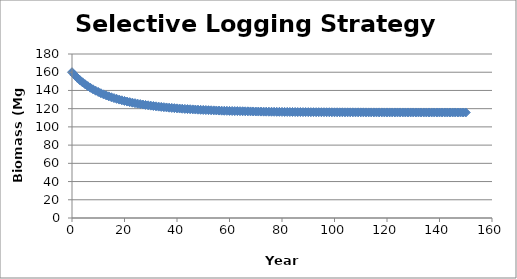
| Category | Series 0 |
|---|---|
| 0.0 | 160 |
| 1.0 | 156.8 |
| 2.0 | 153.914 |
| 3.0 | 151.299 |
| 4.0 | 148.922 |
| 5.0 | 146.753 |
| 6.0 | 144.768 |
| 7.0 | 142.946 |
| 8.0 | 141.27 |
| 9.0 | 139.724 |
| 10.0 | 138.294 |
| 11.0 | 136.97 |
| 12.0 | 135.742 |
| 13.0 | 134.6 |
| 14.0 | 133.537 |
| 15.0 | 132.545 |
| 16.0 | 131.62 |
| 17.0 | 130.754 |
| 18.0 | 129.944 |
| 19.0 | 129.185 |
| 20.0 | 128.473 |
| 21.0 | 127.805 |
| 22.0 | 127.176 |
| 23.0 | 126.585 |
| 24.0 | 126.029 |
| 25.0 | 125.505 |
| 26.0 | 125.011 |
| 27.0 | 124.544 |
| 28.0 | 124.104 |
| 29.0 | 123.689 |
| 30.0 | 123.296 |
| 31.0 | 122.924 |
| 32.0 | 122.573 |
| 33.0 | 122.24 |
| 34.0 | 121.925 |
| 35.0 | 121.626 |
| 36.0 | 121.343 |
| 37.0 | 121.075 |
| 38.0 | 120.82 |
| 39.0 | 120.579 |
| 40.0 | 120.35 |
| 41.0 | 120.132 |
| 42.0 | 119.926 |
| 43.0 | 119.729 |
| 44.0 | 119.543 |
| 45.0 | 119.366 |
| 46.0 | 119.197 |
| 47.0 | 119.037 |
| 48.0 | 118.884 |
| 49.0 | 118.739 |
| 50.0 | 118.601 |
| 51.0 | 118.47 |
| 52.0 | 118.345 |
| 53.0 | 118.226 |
| 54.0 | 118.113 |
| 55.0 | 118.005 |
| 56.0 | 117.902 |
| 57.0 | 117.804 |
| 58.0 | 117.711 |
| 59.0 | 117.622 |
| 60.0 | 117.538 |
| 61.0 | 117.457 |
| 62.0 | 117.38 |
| 63.0 | 117.307 |
| 64.0 | 117.237 |
| 65.0 | 117.17 |
| 66.0 | 117.107 |
| 67.0 | 117.046 |
| 68.0 | 116.988 |
| 69.0 | 116.933 |
| 70.0 | 116.881 |
| 71.0 | 116.831 |
| 72.0 | 116.783 |
| 73.0 | 116.737 |
| 74.0 | 116.694 |
| 75.0 | 116.652 |
| 76.0 | 116.613 |
| 77.0 | 116.575 |
| 78.0 | 116.539 |
| 79.0 | 116.504 |
| 80.0 | 116.471 |
| 81.0 | 116.44 |
| 82.0 | 116.41 |
| 83.0 | 116.382 |
| 84.0 | 116.354 |
| 85.0 | 116.328 |
| 86.0 | 116.303 |
| 87.0 | 116.28 |
| 88.0 | 116.257 |
| 89.0 | 116.236 |
| 90.0 | 116.215 |
| 91.0 | 116.195 |
| 92.0 | 116.176 |
| 93.0 | 116.158 |
| 94.0 | 116.141 |
| 95.0 | 116.125 |
| 96.0 | 116.109 |
| 97.0 | 116.094 |
| 98.0 | 116.08 |
| 99.0 | 116.067 |
| 100.0 | 116.054 |
| 101.0 | 116.041 |
| 102.0 | 116.029 |
| 103.0 | 116.018 |
| 104.0 | 116.007 |
| 105.0 | 115.997 |
| 106.0 | 115.987 |
| 107.0 | 115.978 |
| 108.0 | 115.969 |
| 109.0 | 115.96 |
| 110.0 | 115.952 |
| 111.0 | 115.944 |
| 112.0 | 115.936 |
| 113.0 | 115.929 |
| 114.0 | 115.922 |
| 115.0 | 115.916 |
| 116.0 | 115.91 |
| 117.0 | 115.904 |
| 118.0 | 115.898 |
| 119.0 | 115.893 |
| 120.0 | 115.888 |
| 121.0 | 115.883 |
| 122.0 | 115.878 |
| 123.0 | 115.873 |
| 124.0 | 115.869 |
| 125.0 | 115.865 |
| 126.0 | 115.861 |
| 127.0 | 115.857 |
| 128.0 | 115.854 |
| 129.0 | 115.85 |
| 130.0 | 115.847 |
| 131.0 | 115.844 |
| 132.0 | 115.841 |
| 133.0 | 115.838 |
| 134.0 | 115.835 |
| 135.0 | 115.833 |
| 136.0 | 115.83 |
| 137.0 | 115.828 |
| 138.0 | 115.826 |
| 139.0 | 115.823 |
| 140.0 | 115.821 |
| 141.0 | 115.819 |
| 142.0 | 115.817 |
| 143.0 | 115.816 |
| 144.0 | 115.814 |
| 145.0 | 115.812 |
| 146.0 | 115.811 |
| 147.0 | 115.809 |
| 148.0 | 115.808 |
| 149.0 | 115.806 |
| 150.0 | 115.805 |